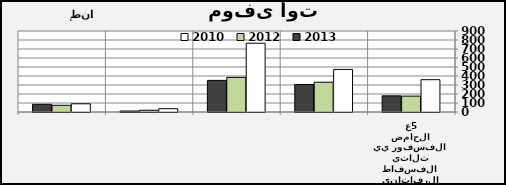
| Category | 2010 | 2012 | 2013 |
|---|---|---|---|
| 0 | 358.999 | 176.268 | 179.828 |
| 1 | 473.189 | 330.995 | 305.74 |
| 2 | 764.155 | 384.778 | 351.073 |
| 3 | 36.94 | 19.3 | 10.8 |
| 4 | 91.258 | 74.521 | 85.285 |